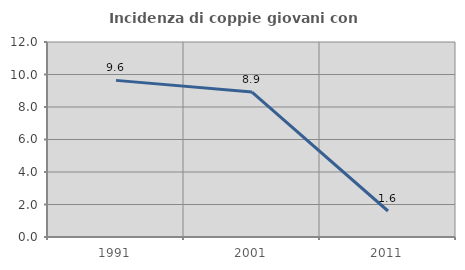
| Category | Incidenza di coppie giovani con figli |
|---|---|
| 1991.0 | 9.639 |
| 2001.0 | 8.917 |
| 2011.0 | 1.6 |